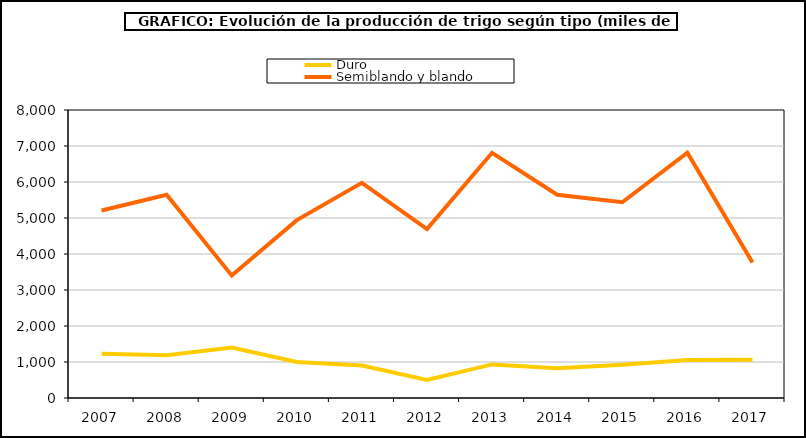
| Category | Duro | Semiblando y blando |
|---|---|---|
| 2007 | 1227.124 | 5209.235 |
| 2008 | 1184.844 | 5646.617 |
| 2009 | 1401.499 | 3403.273 |
| 2010 | 999.861 | 4941.336 |
| 2011 | 900.352 | 5976.299 |
| 2012 | 499.493 | 4690.335 |
| 2013 | 933.268 | 6811.661 |
| 2014 | 825.433 | 5647.301 |
| 2015 | 924.956 | 5437.736 |
| 2016 | 1057.913 | 6815.222 |
| 2017 | 1061.648 | 3763.461 |